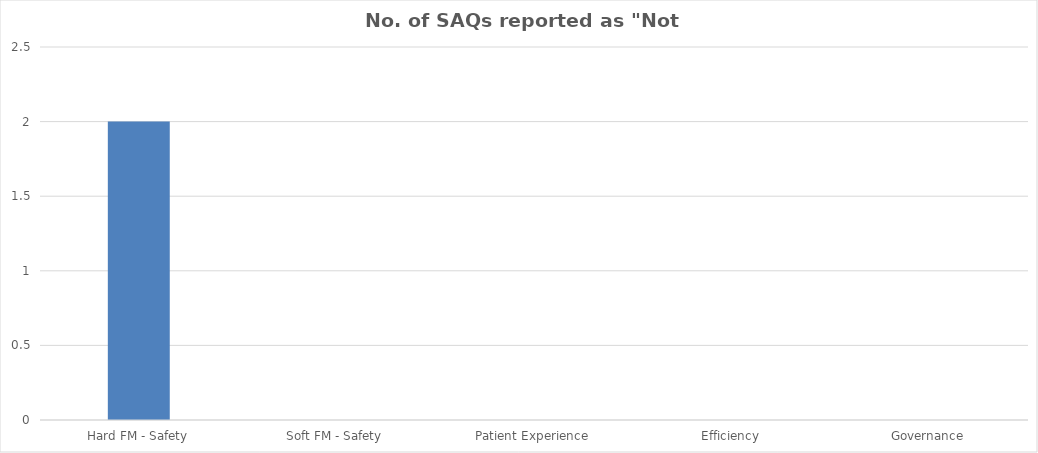
| Category | Series 0 |
|---|---|
| Hard FM - Safety | 2 |
| Soft FM - Safety | 0 |
| Patient Experience | 0 |
| Efficiency | 0 |
| Governance | 0 |